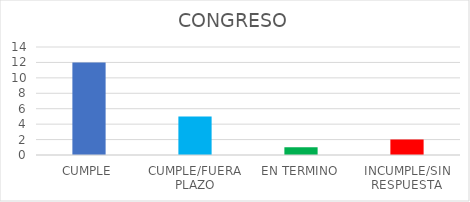
| Category | Series 0 |
|---|---|
| CUMPLE | 12 |
| CUMPLE/FUERA PLAZO | 5 |
| EN TERMINO | 1 |
| INCUMPLE/SIN RESPUESTA | 2 |